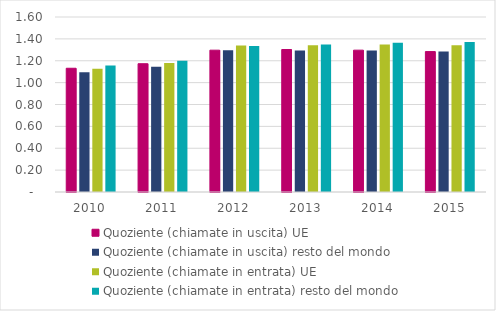
| Category | Quoziente (chiamate in uscita) UE | Quoziente (chiamate in uscita) resto del mondo | Quoziente (chiamate in entrata) UE | Quoziente (chiamate in entrata) resto del mondo |
|---|---|---|---|---|
| 2010.0 | 1.131 | 1.096 | 1.128 | 1.156 |
| 2011.0 | 1.173 | 1.146 | 1.18 | 1.2 |
| 2012.0 | 1.297 | 1.296 | 1.341 | 1.335 |
| 2013.0 | 1.303 | 1.295 | 1.342 | 1.348 |
| 2014.0 | 1.297 | 1.293 | 1.349 | 1.364 |
| 2015.0 | 1.284 | 1.285 | 1.341 | 1.372 |